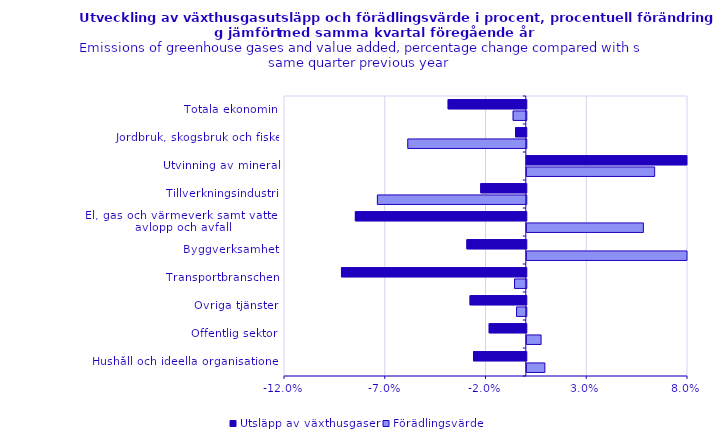
| Category | Utsläpp av växthusgaser | Förädlingsvärde |
|---|---|---|
| Totala ekonomin | -0.039 | -0.007 |
| Jordbruk, skogsbruk och fiske | -0.005 | -0.059 |
| Utvinning av mineral | 0.114 | 0.063 |
| Tillverkningsindustri | -0.023 | -0.074 |
| El, gas och värmeverk samt vatten, avlopp och avfall | -0.085 | 0.058 |
| Byggverksamhet | -0.029 | 0.082 |
| Transportbranschen | -0.092 | -0.006 |
| Övriga tjänster | -0.028 | -0.005 |
| Offentlig sektor | -0.018 | 0.007 |
| Hushåll och ideella organisationer | -0.026 | 0.009 |